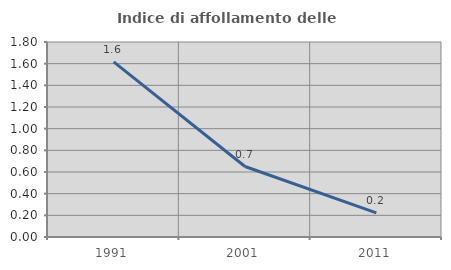
| Category | Indice di affollamento delle abitazioni  |
|---|---|
| 1991.0 | 1.617 |
| 2001.0 | 0.65 |
| 2011.0 | 0.223 |